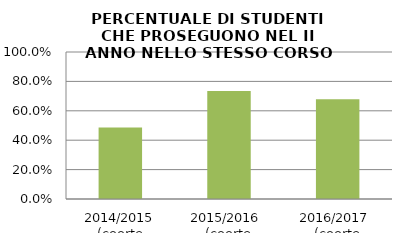
| Category | 2014/2015 (coorte 2013/14) 2015/2016  (coorte 2014/15) 2016/2017  (coorte 2015/16) |
|---|---|
| 2014/2015 (coorte 2013/14) | 0.486 |
| 2015/2016  (coorte 2014/15) | 0.736 |
| 2016/2017  (coorte 2015/16) | 0.679 |